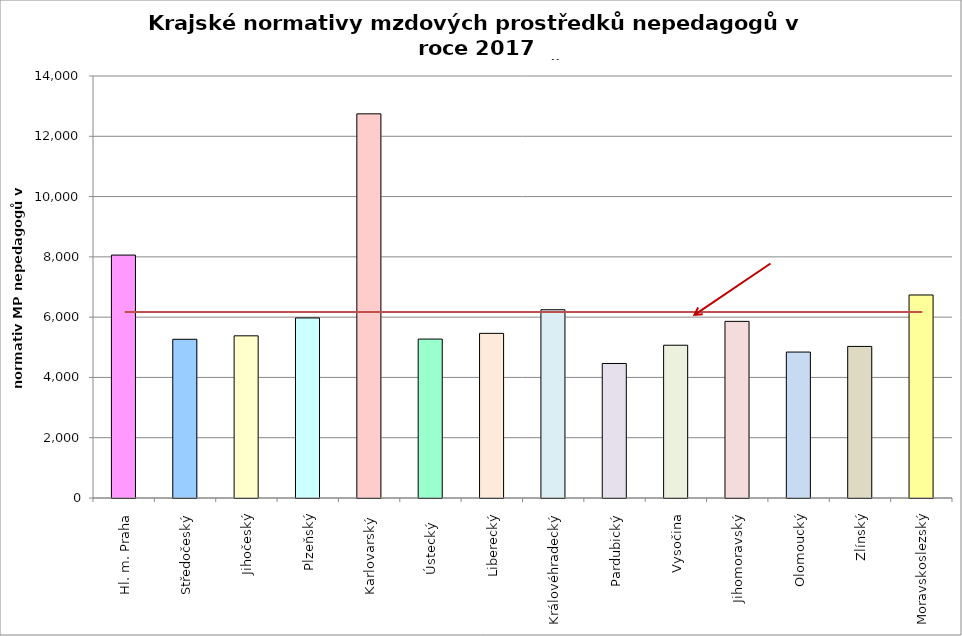
| Category | Series 0 |
|---|---|
| Hl. m. Praha | 8059.2 |
| Středočeský | 5265.356 |
| Jihočeský | 5380.277 |
| Plzeňský | 5974.125 |
| Karlovarský  | 12744.828 |
| Ústecký   | 5272.634 |
| Liberecký | 5461.7 |
| Královéhradecký | 6245.763 |
| Pardubický | 4462.185 |
| Vysočina | 5068.511 |
| Jihomoravský | 5859.962 |
| Olomoucký | 4841.956 |
| Zlínský | 5028.902 |
| Moravskoslezský | 6734.648 |